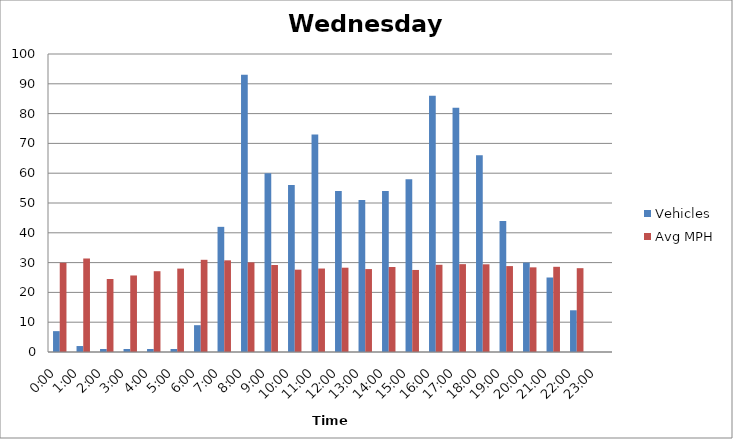
| Category | Vehicles | Avg MPH |
|---|---|---|
| 0:00 | 7 | 29.94 |
| 1:00 | 2 | 31.38 |
| 2:00 | 1 | 24.5 |
| 3:00 | 1 | 25.68 |
| 4:00 | 1 | 27.11 |
| 5:00 | 1 | 27.99 |
| 6:00 | 9 | 30.94 |
| 7:00 | 42 | 30.76 |
| 8:00 | 93 | 30.07 |
| 9:00 | 60 | 29.19 |
| 10:00 | 56 | 27.63 |
| 11:00 | 73 | 28.01 |
| 12:00 | 54 | 28.29 |
| 13:00 | 51 | 27.83 |
| 14:00 | 54 | 28.52 |
| 15:00 | 58 | 27.53 |
| 16:00 | 86 | 29.27 |
| 17:00 | 82 | 29.48 |
| 18:00 | 66 | 29.43 |
| 19:00 | 44 | 28.83 |
| 20:00 | 30 | 28.41 |
| 21:00 | 25 | 28.59 |
| 22:00 | 14 | 28.13 |
| 23:00 | 0 | 0 |